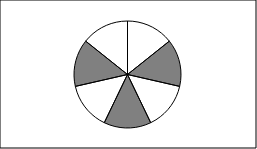
| Category | Series 0 | Series 1 |
|---|---|---|
| 0 | 1 |  |
| 1 | 1 |  |
| 2 | 1 |  |
| 3 | 1 |  |
| 4 | 1 |  |
| 5 | 1 |  |
| 6 | 1 |  |